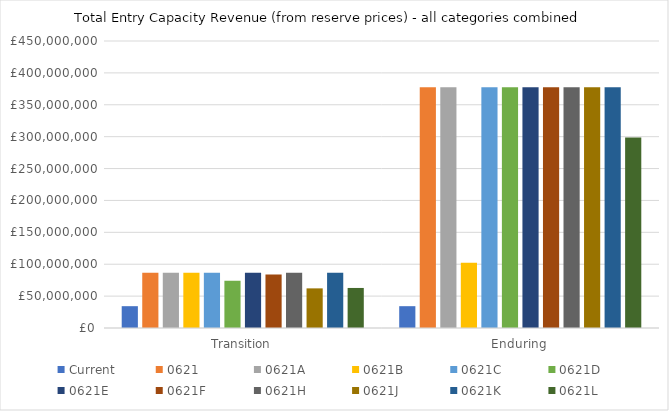
| Category | Current | 0621 | 0621A | 0621B | 0621C | 0621D | 0621E | 0621F | 0621H | 0621J | 0621K | 0621L |
|---|---|---|---|---|---|---|---|---|---|---|---|---|
| Transition | 34216434.719 | 86793019.031 | 86793019.031 | 86793019.031 | 86793019.031 | 74090300.629 | 86793019.031 | 83968521.836 | 86793019.031 | 62135681.728 | 86793019.031 | 62784290.484 |
| Enduring | 34216434.719 | 377492200.102 | 377492200.102 | 102272175.39 | 377492200.102 | 377492200.102 | 377492200.102 | 377492200.102 | 377492200.102 | 377492200.102 | 377492200.102 | 298758070.75 |